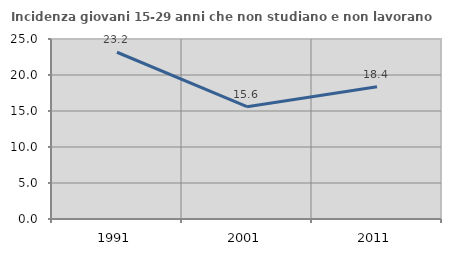
| Category | Incidenza giovani 15-29 anni che non studiano e non lavorano  |
|---|---|
| 1991.0 | 23.16 |
| 2001.0 | 15.601 |
| 2011.0 | 18.382 |